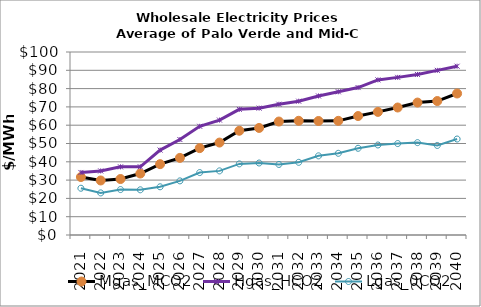
| Category | Mgas_MCO2 | Hgas_HCO2 | Lgas_0CO2 |
|---|---|---|---|
| 2021.0 | 31.67 | 34.174 | 25.558 |
| 2022.0 | 29.793 | 35.01 | 23.008 |
| 2023.0 | 30.589 | 37.239 | 24.832 |
| 2024.0 | 33.584 | 37.269 | 24.698 |
| 2025.0 | 38.715 | 46.405 | 26.343 |
| 2026.0 | 42.143 | 52.165 | 29.574 |
| 2027.0 | 47.472 | 59.397 | 34.118 |
| 2028.0 | 50.511 | 62.807 | 35.039 |
| 2029.0 | 56.963 | 68.665 | 38.865 |
| 2030.0 | 58.505 | 69.323 | 39.336 |
| 2031.0 | 61.997 | 71.452 | 38.558 |
| 2032.0 | 62.408 | 73.114 | 39.713 |
| 2033.0 | 62.299 | 75.977 | 43.252 |
| 2034.0 | 62.384 | 78.264 | 44.64 |
| 2035.0 | 65.008 | 80.565 | 47.384 |
| 2036.0 | 67.272 | 84.761 | 49.189 |
| 2037.0 | 69.669 | 86.136 | 49.972 |
| 2038.0 | 72.371 | 87.731 | 50.483 |
| 2039.0 | 73.204 | 89.973 | 48.933 |
| 2040.0 | 77.326 | 92.23 | 52.448 |